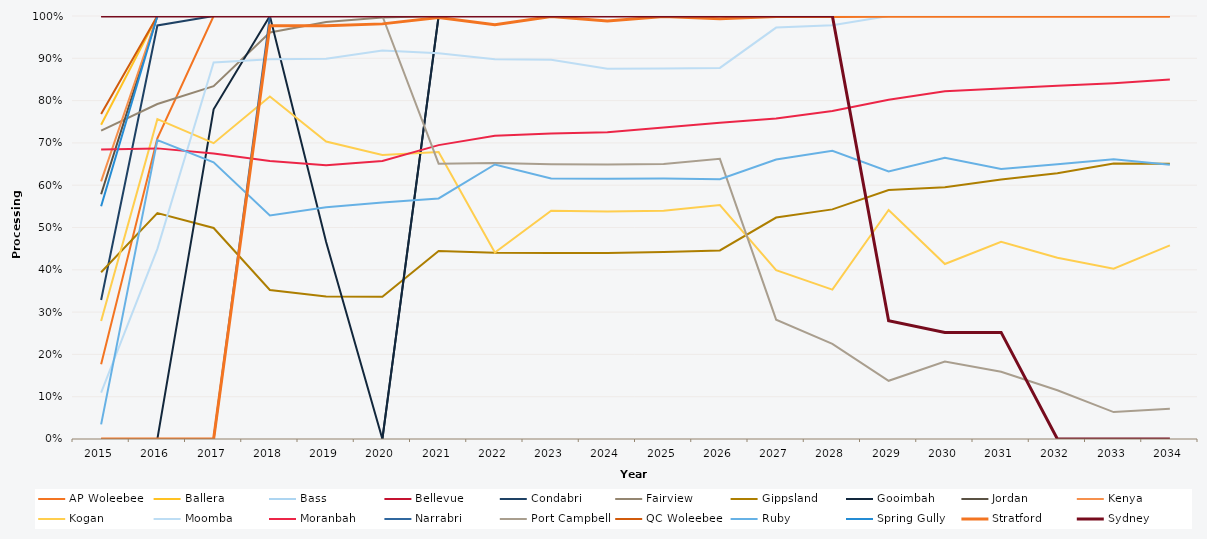
| Category | AP Woleebee | Ballera | Bass | Bellevue | Condabri | Fairview | Gippsland | Gooimbah | Jordan | Kenya | Kogan | Moomba | Moranbah | Narrabri | Port Campbell | QC Woleebee | Ruby | Spring Gully | Stratford | Sydney |
|---|---|---|---|---|---|---|---|---|---|---|---|---|---|---|---|---|---|---|---|---|
| 2015.0 | 0.177 | 0.743 | 1 | 1 | 0.329 | 0.729 | 0.394 | 0 | 0.579 | 0.609 | 0.279 | 0.11 | 0.684 | 0 | 1.496 | 0.768 | 0.035 | 0.55 | 0 | 1 |
| 2016.0 | 0.711 | 1 | 1 | 1 | 0.978 | 0.792 | 0.534 | 0 | 1 | 1 | 0.756 | 0.449 | 0.687 | 0 | 1 | 1 | 0.707 | 1 | 0 | 1 |
| 2017.0 | 1 | 1 | 1 | 1 | 1 | 0.834 | 0.499 | 0.779 | 1 | 1 | 0.699 | 0.89 | 0.675 | 0 | 1 | 1 | 0.654 | 1 | 0 | 1 |
| 2018.0 | 1 | 1 | 1 | 1 | 1 | 0.961 | 0.352 | 1 | 1 | 1 | 0.81 | 0.898 | 0.657 | 1 | 1 | 1 | 0.528 | 1 | 0.977 | 1 |
| 2019.0 | 1 | 1 | 1 | 1 | 1 | 0.986 | 0.337 | 0.466 | 1 | 1 | 0.703 | 0.899 | 0.647 | 1 | 1 | 1 | 0.548 | 1 | 0.977 | 1 |
| 2020.0 | 1 | 1 | 1 | 1 | 1 | 0.996 | 0.336 | 0 | 1 | 1 | 0.671 | 0.919 | 0.657 | 1 | 1 | 1 | 0.559 | 1 | 0.981 | 1 |
| 2021.0 | 1 | 1 | 1 | 1 | 1 | 1 | 0.445 | 1 | 1 | 1 | 0.678 | 0.912 | 0.695 | 1 | 0.651 | 1 | 0.569 | 1 | 0.996 | 1 |
| 2022.0 | 1 | 1 | 1 | 1 | 1 | 1 | 0.44 | 1 | 1 | 1 | 0.441 | 0.898 | 0.717 | 1 | 0.652 | 1 | 0.649 | 1 | 0.979 | 1 |
| 2023.0 | 1 | 1 | 1 | 1 | 1 | 1 | 0.44 | 1 | 1 | 1 | 0.54 | 0.896 | 0.722 | 1 | 0.65 | 1 | 0.616 | 1 | 0.999 | 1 |
| 2024.0 | 1 | 1 | 1 | 1 | 1 | 1 | 0.44 | 1 | 1 | 1 | 0.538 | 0.875 | 0.725 | 1 | 0.649 | 1 | 0.615 | 1 | 0.988 | 1 |
| 2025.0 | 1 | 1 | 1 | 1 | 1 | 1 | 0.442 | 1 | 1 | 1 | 0.539 | 0.876 | 0.736 | 1 | 0.65 | 1 | 0.616 | 1 | 0.999 | 1 |
| 2026.0 | 1 | 1 | 1 | 1 | 1 | 1 | 0.446 | 1 | 1 | 1 | 0.553 | 0.877 | 0.748 | 1 | 0.662 | 1 | 0.614 | 1 | 0.993 | 1 |
| 2027.0 | 1 | 1 | 1 | 1 | 1 | 1 | 0.523 | 1 | 1 | 1 | 0.399 | 0.973 | 0.758 | 1 | 0.282 | 1 | 0.661 | 1 | 0.999 | 1 |
| 2028.0 | 1 | 1 | 1 | 1 | 1 | 1 | 0.543 | 1 | 1 | 1 | 0.353 | 0.978 | 0.776 | 1 | 0.225 | 1 | 0.681 | 1 | 0.999 | 1 |
| 2029.0 | 1 | 1 | 1 | 1 | 1 | 1 | 0.589 | 1 | 1 | 1 | 0.542 | 1 | 0.802 | 1 | 0.138 | 1 | 0.633 | 1 | 0.999 | 0.279 |
| 2030.0 | 1 | 1 | 1 | 1 | 1 | 1 | 0.595 | 1 | 1 | 1 | 0.414 | 1 | 0.822 | 1 | 0.183 | 1 | 0.665 | 1 | 0.999 | 0.252 |
| 2031.0 | 1 | 1 | 1 | 1 | 1 | 1 | 0.613 | 1 | 1 | 1 | 0.466 | 1 | 0.829 | 1 | 0.159 | 1 | 0.638 | 1 | 0.999 | 0.252 |
| 2032.0 | 1 | 1 | 1 | 1 | 1 | 1 | 0.628 | 1 | 1 | 1 | 0.429 | 1 | 0.835 | 1 | 0.115 | 1 | 0.65 | 1 | 0.999 | 0 |
| 2033.0 | 1 | 1 | 1 | 1 | 1 | 1 | 0.651 | 1 | 1 | 1 | 0.403 | 1 | 0.841 | 1 | 0.064 | 1 | 0.661 | 1 | 0.999 | 0 |
| 2034.0 | 1 | 1 | 1 | 1 | 1 | 1 | 0.651 | 1 | 1 | 1 | 0.458 | 1 | 0.85 | 1 | 0.072 | 1 | 0.648 | 1 | 0.999 | 0 |